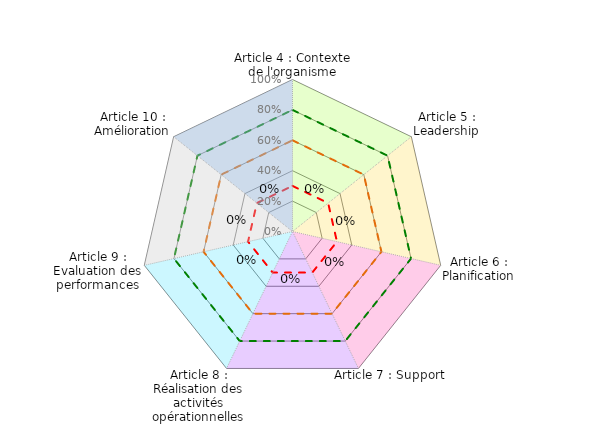
| Category | Coloriage Art4 | Coloriage Art5 | Coloriage Art6 | Coloriage Art7 | Coloriage Art8 | Informel | Convaincant | Conforme | Evaluation Mutuelle | Art 9 | Art 10 |
|---|---|---|---|---|---|---|---|---|---|---|---|
| Article 4 : Contexte de l'organisme | 1 | 0 | 0 | 0 | 0 | 0.3 | 0.6 | 0.8 | 0 | 0 | 1 |
| Article 5 : Leadership | 1 | 1 | 0 | 0 | 0 | 0.3 | 0.6 | 0.8 | 0 | 0 | 0 |
| Article 6 : Planification | 0 | 1 | 1 | 0 | 0 | 0.3 | 0.6 | 0.8 | 0 | 0 | 0 |
| Article 7 : Support | 0 | 0 | 1 | 1 | 0 | 0.3 | 0.6 | 0.8 | 0 | 0 | 0 |
| Article 8 : Réalisation des activités opérationnelles | 0 | 0 | 0 | 1 | 1 | 0.3 | 0.6 | 0.8 | 0 | 0 | 0 |
| Article 9 : Evaluation des performances | 0 | 0 | 0 | 0 | 1 | 0.3 | 0.6 | 0.8 | 0 | 1 | 0 |
| Article 10 : Amélioration | 0 | 0 | 0 | 0 | 0 | 0.3 | 0.6 | 0.8 | 0 | 1 | 1 |